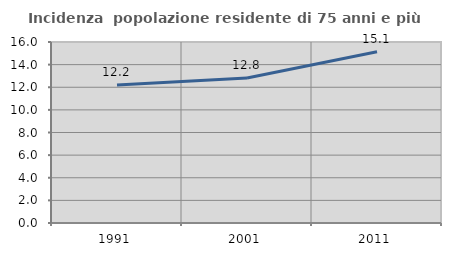
| Category | Incidenza  popolazione residente di 75 anni e più |
|---|---|
| 1991.0 | 12.209 |
| 2001.0 | 12.817 |
| 2011.0 | 15.134 |